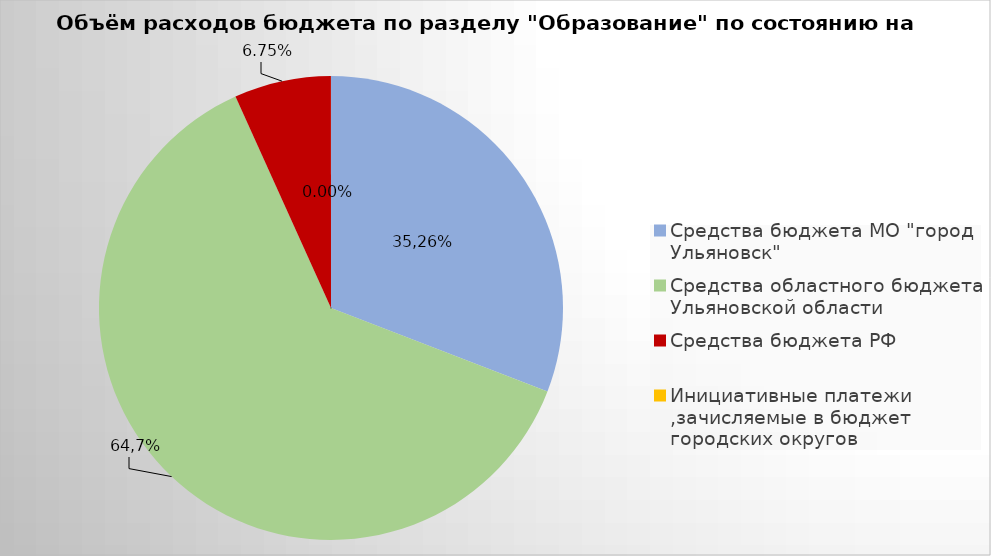
| Category | Series 0 |
|---|---|
| Средства бюджета МО "город Ульяновск" | 1837439.26 |
| Средства областного бюджета Ульяновской области | 3714562.4 |
| Средства бюджета РФ | 401928.3 |
| Инициативные платежи ,зачисляемые в бюджет городских округов | 200 |